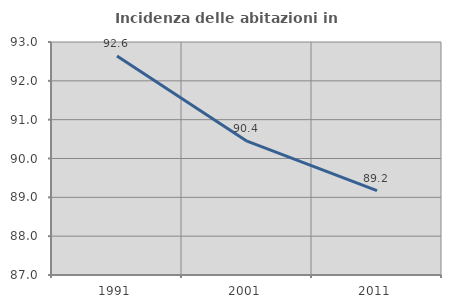
| Category | Incidenza delle abitazioni in proprietà  |
|---|---|
| 1991.0 | 92.638 |
| 2001.0 | 90.446 |
| 2011.0 | 89.172 |